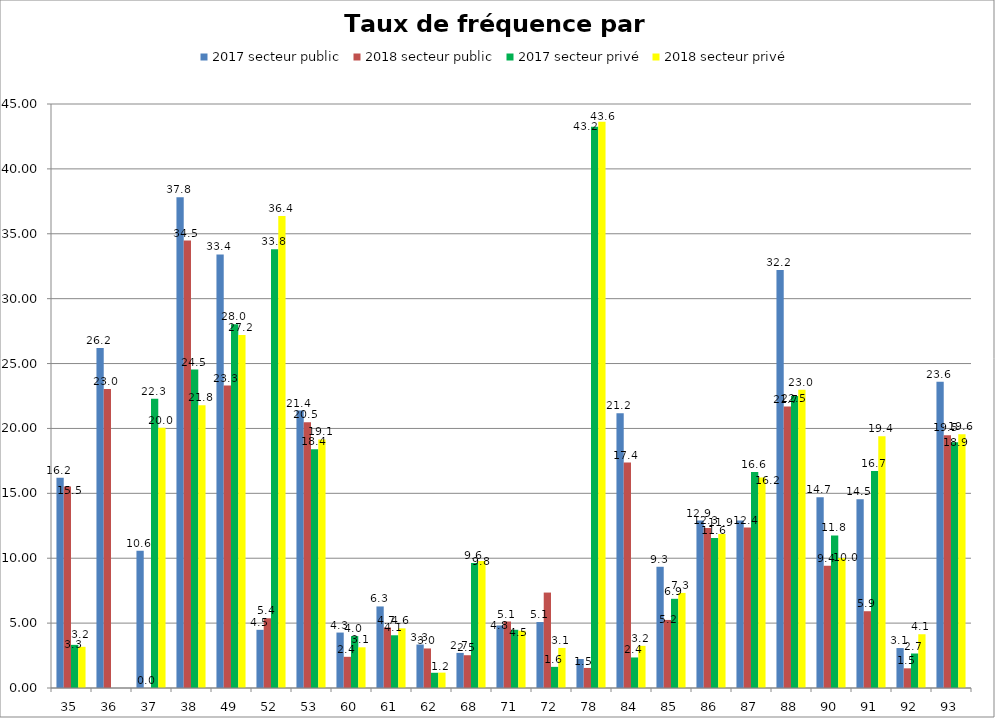
| Category | 2017 secteur public | 2018 secteur public | 2017 secteur privé | 2018 secteur privé |
|---|---|---|---|---|
| 35 | 16.197 | 15.52 | 3.324 | 3.174 |
| 36 | 26.203 | 23.04 | 0 | 0 |
| 37 | 10.573 | 0 | 22.29 | 20.05 |
| 38 | 37.816 | 34.48 | 24.535 | 21.796 |
| 49 | 33.407 | 23.301 | 28.027 | 27.205 |
| 52 | 4.483 | 5.372 | 33.804 | 36.364 |
| 53 | 21.375 | 20.475 | 18.392 | 19.148 |
| 60 | 4.272 | 2.403 | 3.999 | 3.135 |
| 61 | 6.284 | 4.66 | 4.063 | 4.597 |
| 62 | 3.349 | 3.047 | 1.172 | 1.184 |
| 68 | 2.705 | 2.525 | 9.635 | 9.787 |
| 71 | 4.819 | 5.124 | 4.485 | 4.415 |
| 72 | 5.083 | 7.354 | 1.628 | 3.089 |
| 78 | 2.235 | 1.546 | 43.248 | 43.627 |
| 84 | 21.172 | 17.369 | 2.353 | 3.247 |
| 85 | 9.341 | 5.245 | 6.872 | 7.327 |
| 86 | 12.899 | 12.337 | 11.565 | 11.867 |
| 87 | 12.909 | 12.359 | 16.646 | 16.216 |
| 88 | 32.199 | 21.683 | 22.505 | 22.975 |
| 90 | 14.691 | 9.419 | 11.758 | 10.008 |
| 91 | 14.549 | 5.916 | 16.713 | 19.395 |
| 92 | 3.078 | 1.515 | 2.657 | 4.142 |
| 93 | 23.603 | 19.472 | 18.936 | 19.562 |